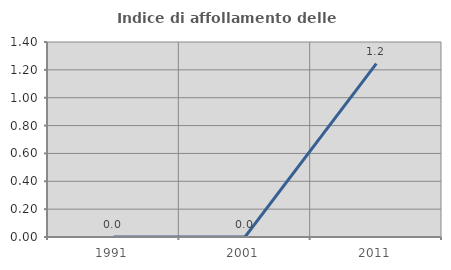
| Category | Indice di affollamento delle abitazioni  |
|---|---|
| 1991.0 | 0 |
| 2001.0 | 0 |
| 2011.0 | 1.245 |